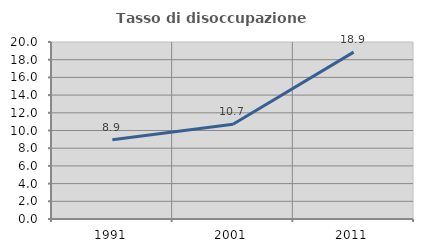
| Category | Tasso di disoccupazione giovanile  |
|---|---|
| 1991.0 | 8.949 |
| 2001.0 | 10.703 |
| 2011.0 | 18.852 |